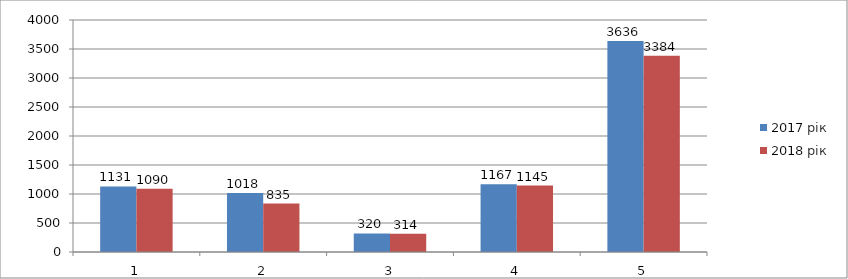
| Category | 2017 рік | 2018 рік |
|---|---|---|
| 0 | 1131 | 1090 |
| 1 | 1018 | 835 |
| 2 | 320 | 314 |
| 3 | 1167 | 1145 |
| 4 | 3636 | 3384 |